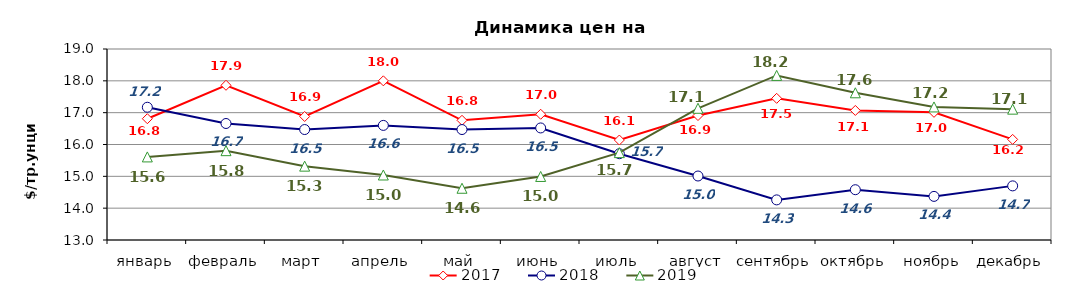
| Category | 2017 | 2018 | 2019 |
|---|---|---|---|
| январь | 16.81 | 17.17 | 15.61 |
| февраль | 17.86 | 16.66 | 15.806 |
| март | 16.88 | 16.47 | 15.32 |
| апрель | 18 | 16.6 | 15.042 |
| май | 16.76 | 16.47 | 14.625 |
| июнь | 16.95 | 16.52 | 14.996 |
| июль | 16.14 | 15.71 | 15.745 |
| август | 16.91 | 15.01 | 17.138 |
| сентябрь | 17.45 | 14.26 | 18.17 |
| октябрь | 17.07 | 14.58 | 17.625 |
| ноябрь | 17.01 | 14.37 | 17.18 |
| декабрь | 16.16 | 14.7 | 17.11 |